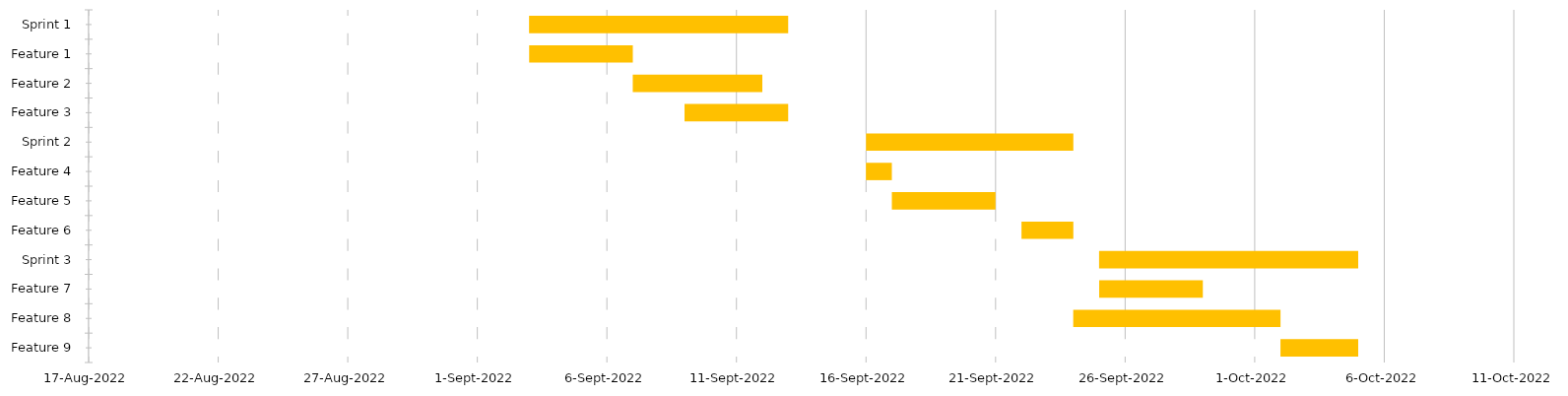
| Category | START | DAUER (TAGE) |
|---|---|---|
| Sprint 1 | 2022-09-03 | 10 |
| Feature 1 | 2022-09-03 | 4 |
| Feature 2 | 2022-09-07 | 5 |
| Feature 3 | 2022-09-09 | 4 |
| Sprint 2 | 2022-09-16 | 8 |
| Feature 4 | 2022-09-16 | 1 |
| Feature 5 | 2022-09-17 | 4 |
| Feature 6 | 2022-09-22 | 2 |
| Sprint 3 | 2022-09-25 | 10 |
| Feature 7 | 2022-09-25 | 4 |
| Feature 8 | 2022-09-24 | 8 |
| Feature 9 | 2022-10-02 | 3 |